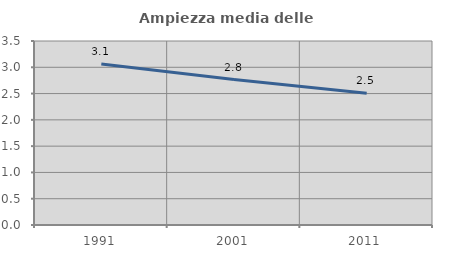
| Category | Ampiezza media delle famiglie |
|---|---|
| 1991.0 | 3.063 |
| 2001.0 | 2.768 |
| 2011.0 | 2.507 |